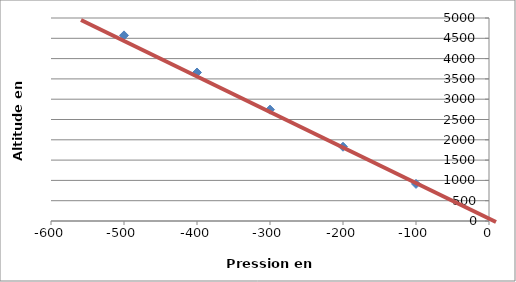
| Category | Series 0 |
|---|---|
| -500.0 | 4572 |
| -400.0 | 3658 |
| -300.0 | 2743 |
| -200.0 | 1829 |
| -100.0 | 914 |